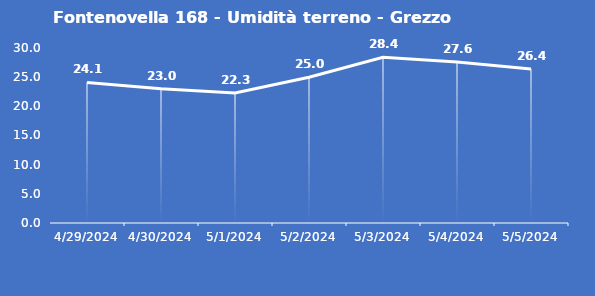
| Category | Fontenovella 168 - Umidità terreno - Grezzo (%VWC) |
|---|---|
| 4/29/24 | 24.1 |
| 4/30/24 | 23 |
| 5/1/24 | 22.3 |
| 5/2/24 | 25 |
| 5/3/24 | 28.4 |
| 5/4/24 | 27.6 |
| 5/5/24 | 26.4 |